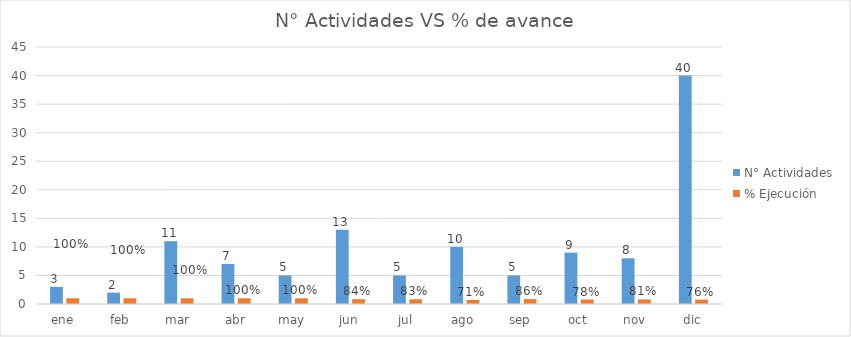
| Category | N° Actividades | % Ejecución |
|---|---|---|
| ene | 3 | 1 |
| feb | 2 | 1 |
| mar | 11 | 1 |
| abr | 7 | 1 |
| may | 5 | 1 |
| jun | 13 | 0.844 |
| jul | 5 | 0.825 |
| ago | 10 | 0.706 |
| sep | 5 | 0.86 |
| oct | 9 | 0.783 |
| nov | 8 | 0.805 |
| dic | 40 | 0.764 |